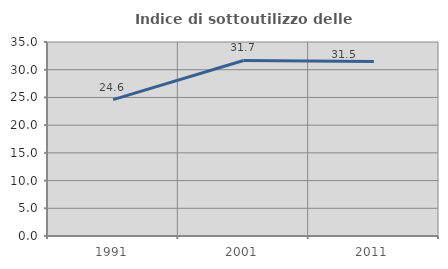
| Category | Indice di sottoutilizzo delle abitazioni  |
|---|---|
| 1991.0 | 24.603 |
| 2001.0 | 31.663 |
| 2011.0 | 31.465 |